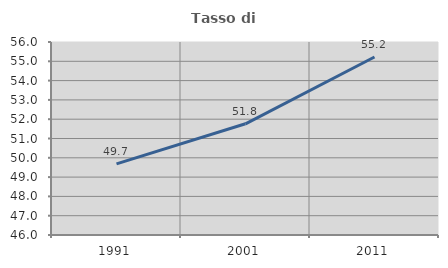
| Category | Tasso di occupazione   |
|---|---|
| 1991.0 | 49.684 |
| 2001.0 | 51.762 |
| 2011.0 | 55.224 |